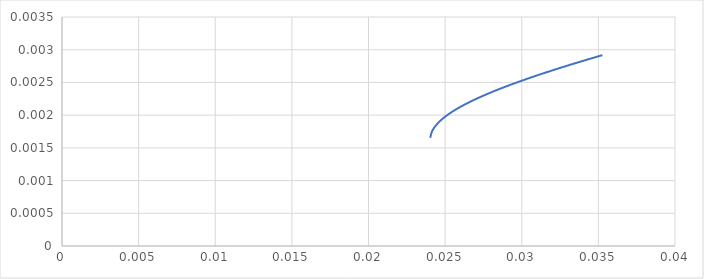
| Category | Retorno |
|---|---|
| 0.024033138229980523 | 0.002 |
| 0.024088180022843367 | 0.002 |
| 0.024209798065605144 | 0.002 |
| 0.024396996738835636 | 0.002 |
| 0.024648281873287728 | 0.002 |
| 0.024961718103292525 | 0.002 |
| 0.025334998795428203 | 0.002 |
| 0.025765523072380368 | 0.002 |
| 0.02625047459295339 | 0.002 |
| 0.026786897458461426 | 0.002 |
| 0.027371765680676733 | 0.002 |
| 0.02800204384395053 | 0.002 |
| 0.028674737737808396 | 0.002 |
| 0.029386934701641942 | 0.002 |
| 0.030135834150027296 | 0.003 |
| 0.030918769228580962 | 0.003 |
| 0.031733220814084535 | 0.003 |
| 0.03257682516442572 | 0.003 |
| 0.03344737649330039 | 0.003 |
| 0.03434282563663793 | 0.003 |
| 0.03526127582866729 | 0.003 |